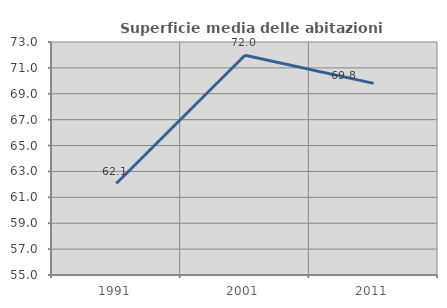
| Category | Superficie media delle abitazioni occupate |
|---|---|
| 1991.0 | 62.068 |
| 2001.0 | 71.975 |
| 2011.0 | 69.805 |